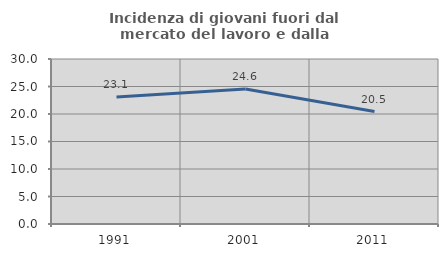
| Category | Incidenza di giovani fuori dal mercato del lavoro e dalla formazione  |
|---|---|
| 1991.0 | 23.096 |
| 2001.0 | 24.561 |
| 2011.0 | 20.451 |